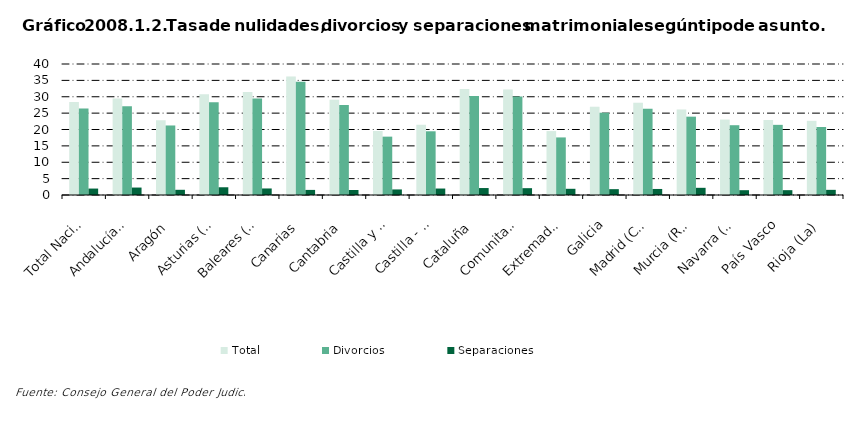
| Category | Total | Divorcios | Separaciones |
|---|---|---|---|
| Total Nacional | 28.394 | 26.391 | 1.965 |
| Andalucía(1) | 29.43 | 27.127 | 2.273 |
| Aragón | 22.82 | 21.23 | 1.59 |
| Asturias (Principado de) | 30.755 | 28.357 | 2.361 |
| Baleares (Illes) | 31.458 | 29.436 | 1.995 |
| Canarias | 36.157 | 34.543 | 1.556 |
| Cantabria | 29.065 | 27.485 | 1.529 |
| Castilla y León | 19.552 | 17.819 | 1.697 |
| Castilla - La Mancha | 21.448 | 19.456 | 1.972 |
| Cataluña | 32.365 | 30.213 | 2.122 |
| Comunitat Valenciana | 32.205 | 30.06 | 2.084 |
| Extremadura | 19.513 | 17.582 | 1.895 |
| Galicia | 26.945 | 25.128 | 1.785 |
| Madrid (Comunidad de) | 28.205 | 26.328 | 1.843 |
| Murcia (Región de) | 26.12 | 23.918 | 2.195 |
| Navarra (Comunidad Foral de) | 23.034 | 21.31 | 1.467 |
| País Vasco | 22.901 | 21.422 | 1.474 |
| Rioja (La) | 22.646 | 20.756 | 1.575 |